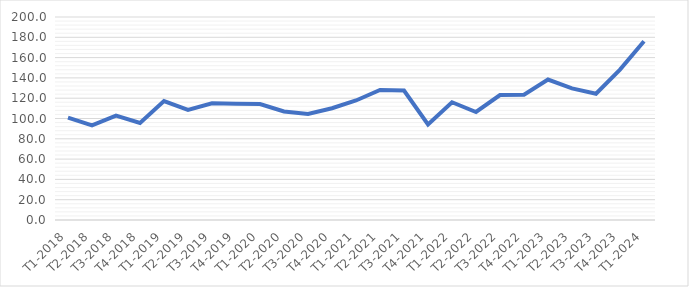
| Category | Series 0 |
|---|---|
| T1-2018 | 100.843 |
| T2-2018 | 93.24 |
| T3-2018 | 102.873 |
| T4-2018 | 95.664 |
| T1-2019 | 117.195 |
| T2-2019 | 108.398 |
| T3-2019 | 114.985 |
| T4-2019 | 114.453 |
| T1-2020 | 114.245 |
| T2-2020 | 106.915 |
| T3-2020 | 104.502 |
| T4-2020 | 110.138 |
| T1-2021 | 117.768 |
| T2-2021 | 128.049 |
| T3-2021 | 127.498 |
| T4-2021 | 94.189 |
| T1-2022 | 116.039 |
| T2-2022 | 106.402 |
| T3-2022 | 123.127 |
| T4-2022 | 123.508 |
| T1-2023 | 138.42 |
| T2-2023 | 129.723 |
| T3-2023 | 124.435 |
| T4-2023 | 148.179 |
| T1-2024 | 176.177 |